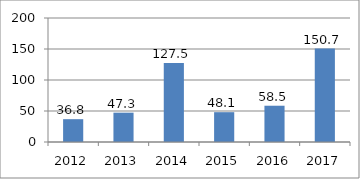
| Category | Series 0 |
|---|---|
| 2012.0 | 36.8 |
| 2013.0 | 47.3 |
| 2014.0 | 127.5 |
| 2015.0 | 48.1 |
| 2016.0 | 58.5 |
| 2017.0 | 150.7 |